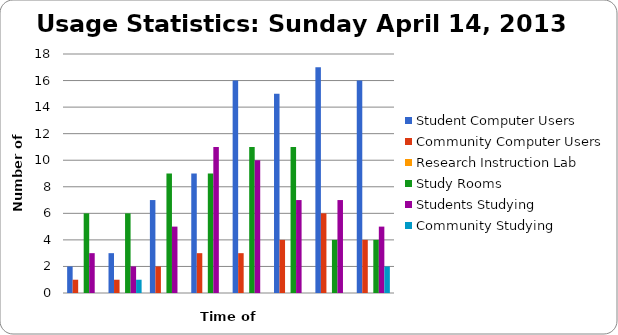
| Category | Student Computer Users | Community Computer Users | Research Instruction Lab | Study Rooms | Students Studying | Community Studying |
|---|---|---|---|---|---|---|
| 10 am | 2 | 1 | 0 | 6 | 3 | 0 |
| 11 am | 3 | 1 | 0 | 6 | 2 | 1 |
| 12 pm | 7 | 2 | 0 | 9 | 5 | 0 |
| 1 pm | 9 | 3 | 0 | 9 | 11 | 0 |
| 2 pm | 16 | 3 | 0 | 11 | 10 | 0 |
| 3 pm | 15 | 4 | 0 | 11 | 7 | 0 |
| 4 pm | 17 | 6 | 0 | 4 | 7 | 0 |
| 5 pm | 16 | 4 | 0 | 4 | 5 | 2 |